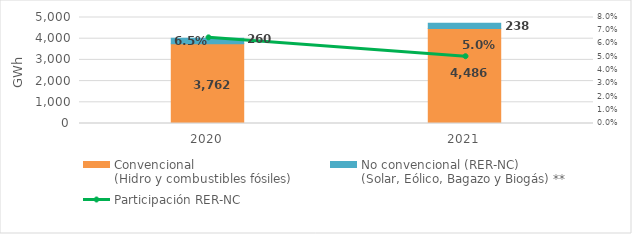
| Category | Convencional
(Hidro y combustibles fósiles) | No convencional (RER-NC)
(Solar, Eólico, Bagazo y Biogás) ** |
|---|---|---|
| 2020.0 | 3761.906 | 259.97 |
| 2021.0 | 4486.49 | 238.173 |